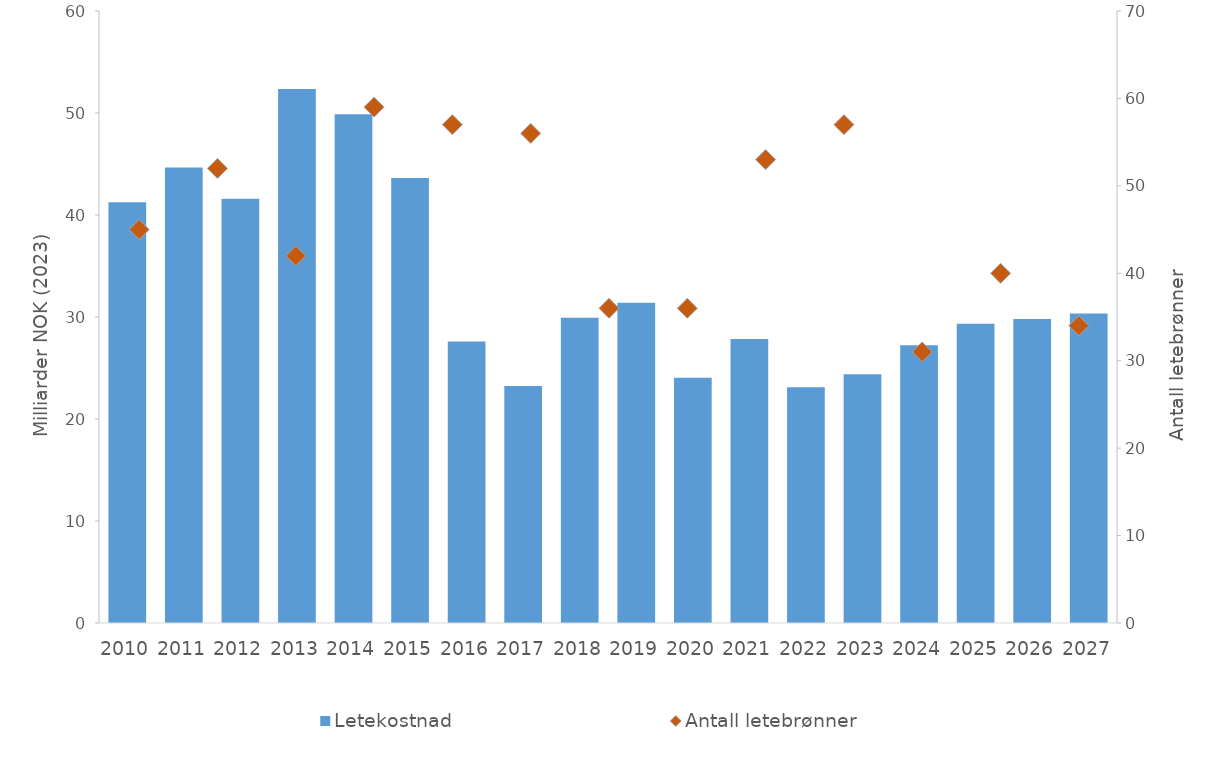
| Category | Letekostnad  |
|---|---|
| 2010.0 | 41.244 |
| 2011.0 | 44.646 |
| 2012.0 | 41.599 |
| 2013.0 | 52.357 |
| 2014.0 | 49.886 |
| 2015.0 | 43.636 |
| 2016.0 | 27.606 |
| 2017.0 | 23.234 |
| 2018.0 | 29.937 |
| 2019.0 | 31.39 |
| 2020.0 | 24.049 |
| 2021.0 | 27.852 |
| 2022.0 | 23.105 |
| 2023.0 | 24.394 |
| 2024.0 | 27.219 |
| 2025.0 | 29.347 |
| 2026.0 | 29.807 |
| 2027.0 | 30.353 |